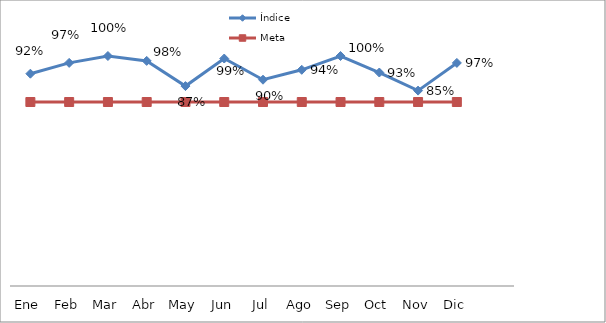
| Category | Índice | Meta |
|---|---|---|
| Ene | 0.923 | 0.8 |
| Feb | 0.97 | 0.8 |
| Mar | 1 | 0.8 |
| Abr | 0.979 | 0.8 |
| May | 0.869 | 0.8 |
| Jun | 0.989 | 0.8 |
| Jul | 0.897 | 0.8 |
| Ago | 0.94 | 0.8 |
| Sep | 1 | 0.8 |
| Oct | 0.928 | 0.8 |
| Nov | 0.85 | 0.8 |
| Dic | 0.97 | 0.8 |